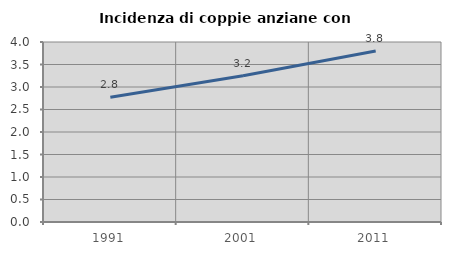
| Category | Incidenza di coppie anziane con figli |
|---|---|
| 1991.0 | 2.774 |
| 2001.0 | 3.248 |
| 2011.0 | 3.799 |